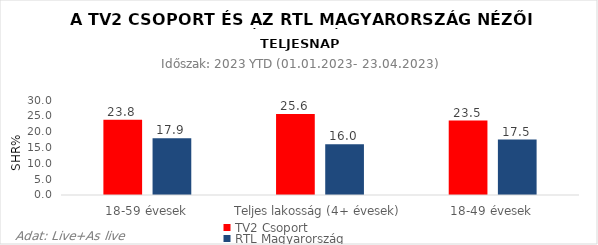
| Category | TV2 Csoport | RTL Magyarország |
|---|---|---|
| 18-59 évesek | 23.8 | 17.9 |
| Teljes lakosság (4+ évesek) | 25.6 | 16 |
| 18-49 évesek | 23.5 | 17.5 |